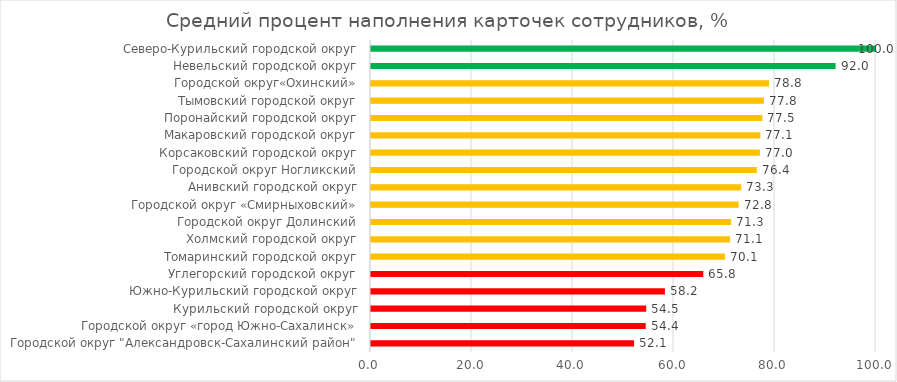
| Category | Средний процент наполнения карточек сотрудников, % |
|---|---|
| Городской округ "Александровск-Сахалинский район" | 52.1 |
| Городской округ «город Южно-Сахалинск» | 54.4 |
| Курильский городской округ | 54.5 |
| Южно-Курильский городской округ | 58.2 |
| Углегорский городской округ | 65.8 |
| Томаринский городской округ | 70.1 |
| Холмский городской округ | 71.1 |
| Городской округ Долинский | 71.3 |
| Городской округ «Смирныховский» | 72.8 |
| Анивский городской округ | 73.3 |
| Городской округ Ногликский | 76.4 |
| Корсаковский городской округ | 77 |
| Макаровский городской округ | 77.1 |
| Поронайский городской округ | 77.5 |
| Тымовский городской округ | 77.8 |
| Городской округ«Охинский» | 78.8 |
| Невельский городской округ | 92 |
| Северо-Курильский городской округ | 100 |